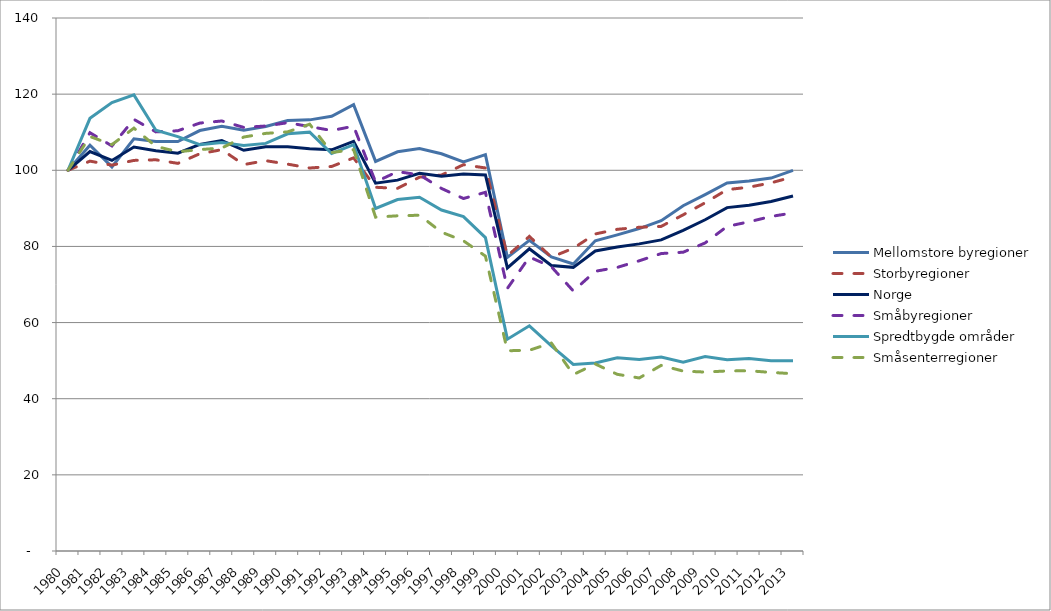
| Category | Mellomstore byregioner | Storbyregioner | Norge | Småbyregioner | Spredtbygde områder | Småsenterregioner |
|---|---|---|---|---|---|---|
| 1980.0 | 100 | 100 | 100 | 100 | 100 | 100 |
| 1981.0 | 106.602 | 102.407 | 104.916 | 109.879 | 113.655 | 108.867 |
| 1982.0 | 100.893 | 101.349 | 102.589 | 106.391 | 117.77 | 106.744 |
| 1983.0 | 108.282 | 102.595 | 106.107 | 113.378 | 119.797 | 111.072 |
| 1984.0 | 107.546 | 102.758 | 105.122 | 110.087 | 110.525 | 106.285 |
| 1985.0 | 107.562 | 101.814 | 104.5 | 110.385 | 108.855 | 104.87 |
| 1986.0 | 110.438 | 104.349 | 106.817 | 112.399 | 106.738 | 105.436 |
| 1987.0 | 111.562 | 105.413 | 107.779 | 112.951 | 107.305 | 105.848 |
| 1988.0 | 110.502 | 101.496 | 105.25 | 111.263 | 106.5 | 108.737 |
| 1989.0 | 111.485 | 102.528 | 106.173 | 111.634 | 107.066 | 109.692 |
| 1990.0 | 113.066 | 101.61 | 106.187 | 112.501 | 109.571 | 110.093 |
| 1991.0 | 113.242 | 100.6 | 105.651 | 111.477 | 110.018 | 112.109 |
| 1992.0 | 114.189 | 100.999 | 105.382 | 110.447 | 104.413 | 104.669 |
| 1993.0 | 117.245 | 103.263 | 107.589 | 111.572 | 106.738 | 105.424 |
| 1994.0 | 102.333 | 95.537 | 96.608 | 96.94 | 89.982 | 87.69 |
| 1995.0 | 104.864 | 95.255 | 97.419 | 99.651 | 92.308 | 88.044 |
| 1996.0 | 105.696 | 98.194 | 99.198 | 98.796 | 92.904 | 88.197 |
| 1997.0 | 104.336 | 98.746 | 98.423 | 95.229 | 89.565 | 83.74 |
| 1998.0 | 102.189 | 101.464 | 98.998 | 92.585 | 87.835 | 81.476 |
| 1999.0 | 104.112 | 100.61 | 98.766 | 94.217 | 82.32 | 77.455 |
| 2000.0 | 77.114 | 77.524 | 74.36 | 68.979 | 55.635 | 52.6 |
| 2001.0 | 81.606 | 82.634 | 79.39 | 77.215 | 59.153 | 52.73 |
| 2002.0 | 77.248 | 77.185 | 74.989 | 74.678 | 53.876 | 54.652 |
| 2003.0 | 75.373 | 79.522 | 74.503 | 68.293 | 49.016 | 46.339 |
| 2004.0 | 81.485 | 83.276 | 78.817 | 73.474 | 49.404 | 49.122 |
| 2005.0 | 83.03 | 84.492 | 79.849 | 74.492 | 50.775 | 46.41 |
| 2006.0 | 84.694 | 85.03 | 80.672 | 76.225 | 50.328 | 45.443 |
| 2007.0 | 86.771 | 85.265 | 81.713 | 78.132 | 50.924 | 48.756 |
| 2008.0 | 90.678 | 88.297 | 84.229 | 78.481 | 49.583 | 47.259 |
| 2009.0 | 93.594 | 91.465 | 87.005 | 80.917 | 51.073 | 46.999 |
| 2010.0 | 96.656 | 94.921 | 90.195 | 85.26 | 50.239 | 47.294 |
| 2011.0 | 97.21 | 95.563 | 90.845 | 86.47 | 50.537 | 47.341 |
| 2012.0 | 97.962 | 96.702 | 91.799 | 87.876 | 50 | 46.905 |
| 2013.0 | 99.997 | 98.278 | 93.243 | 88.805 | 49.97 | 46.575 |